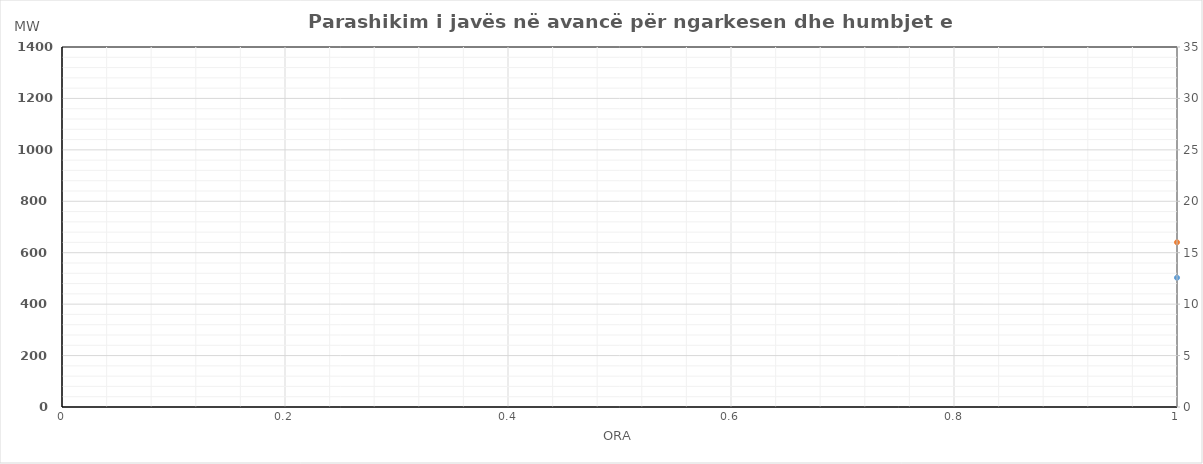
| Category | Ngarkesa (MWh) |
|---|---|
| 0 | 640.57 |
| 1 | 581.53 |
| 2 | 550.22 |
| 3 | 534.24 |
| 4 | 533.21 |
| 5 | 563.13 |
| 6 | 639.2 |
| 7 | 757.28 |
| 8 | 841.59 |
| 9 | 877.02 |
| 10 | 888.29 |
| 11 | 918.61 |
| 12 | 965.35 |
| 13 | 976.27 |
| 14 | 960.03 |
| 15 | 945.75 |
| 16 | 944.26 |
| 17 | 968.7 |
| 18 | 999.93 |
| 19 | 1020.22 |
| 20 | 1059.38 |
| 21 | 991.97 |
| 22 | 892.1 |
| 23 | 778.69 |
| 24 | 668.09 |
| 25 | 603.72 |
| 26 | 570.08 |
| 27 | 554.28 |
| 28 | 552.29 |
| 29 | 582.55 |
| 30 | 660.43 |
| 31 | 781.29 |
| 32 | 873.99 |
| 33 | 909.07 |
| 34 | 937.16 |
| 35 | 960.46 |
| 36 | 965.05 |
| 37 | 981.45 |
| 38 | 961.85 |
| 39 | 947.5 |
| 40 | 942.67 |
| 41 | 965.11 |
| 42 | 1001.29 |
| 43 | 1022.82 |
| 44 | 1047.5 |
| 45 | 991.47 |
| 46 | 882.41 |
| 47 | 762.58 |
| 48 | 671.91 |
| 49 | 616.22 |
| 50 | 581.42 |
| 51 | 565.61 |
| 52 | 565.48 |
| 53 | 594.18 |
| 54 | 675.14 |
| 55 | 796.15 |
| 56 | 883.26 |
| 57 | 915.67 |
| 58 | 928.98 |
| 59 | 954.59 |
| 60 | 960.15 |
| 61 | 971.19 |
| 62 | 953.09 |
| 63 | 943.37 |
| 64 | 953.68 |
| 65 | 974.06 |
| 66 | 1011.63 |
| 67 | 1035.24 |
| 68 | 1067.39 |
| 69 | 1005.08 |
| 70 | 894.14 |
| 71 | 775.34 |
| 72 | 677.79 |
| 73 | 617.33 |
| 74 | 582.63 |
| 75 | 566.37 |
| 76 | 562.48 |
| 77 | 591.75 |
| 78 | 666.5 |
| 79 | 787.33 |
| 80 | 874.62 |
| 81 | 915.63 |
| 82 | 924.8 |
| 83 | 949.61 |
| 84 | 989.89 |
| 85 | 1005.66 |
| 86 | 995.56 |
| 87 | 985.97 |
| 88 | 987.85 |
| 89 | 1018.73 |
| 90 | 1050.47 |
| 91 | 1080.79 |
| 92 | 1115.24 |
| 93 | 1034.36 |
| 94 | 925.03 |
| 95 | 804.65 |
| 96 | 705.18 |
| 97 | 641.34 |
| 98 | 604.72 |
| 99 | 586.92 |
| 100 | 582.41 |
| 101 | 607.72 |
| 102 | 693.28 |
| 103 | 814.89 |
| 104 | 910.79 |
| 105 | 952.26 |
| 106 | 965.46 |
| 107 | 991.2 |
| 108 | 1017.1 |
| 109 | 1033.12 |
| 110 | 1024.33 |
| 111 | 1016.02 |
| 112 | 1016.01 |
| 113 | 1039.23 |
| 114 | 1073.13 |
| 115 | 1102.67 |
| 116 | 1113.82 |
| 117 | 1057.6 |
| 118 | 947.11 |
| 119 | 822.26 |
| 120 | 721.06 |
| 121 | 654.77 |
| 122 | 618.42 |
| 123 | 598.18 |
| 124 | 600.86 |
| 125 | 635.33 |
| 126 | 725.82 |
| 127 | 842.71 |
| 128 | 931.91 |
| 129 | 970.85 |
| 130 | 984.36 |
| 131 | 1003.96 |
| 132 | 1012.45 |
| 133 | 1035.75 |
| 134 | 1018.16 |
| 135 | 1001.95 |
| 136 | 1015.46 |
| 137 | 1051.54 |
| 138 | 1099.87 |
| 139 | 1128.07 |
| 140 | 1149.42 |
| 141 | 1080.69 |
| 142 | 968.8 |
| 143 | 844.63 |
| 144 | 755.56 |
| 145 | 681.97 |
| 146 | 644.72 |
| 147 | 621.48 |
| 148 | 615.26 |
| 149 | 633.23 |
| 150 | 701.02 |
| 151 | 776.71 |
| 152 | 845.11 |
| 153 | 892.75 |
| 154 | 929.16 |
| 155 | 960.96 |
| 156 | 943.65 |
| 157 | 949.65 |
| 158 | 925.46 |
| 159 | 914.15 |
| 160 | 936.86 |
| 161 | 980.64 |
| 162 | 1059.57 |
| 163 | 1087.17 |
| 164 | 1115.02 |
| 165 | 1094.89 |
| 166 | 981.4 |
| 167 | 846.73 |